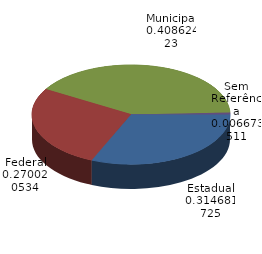
| Category | Qtde Acidentes |
|---|---|
| Estadual | 613 |
| Federal | 526 |
| Municipal | 796 |
| Sem Referência | 13 |